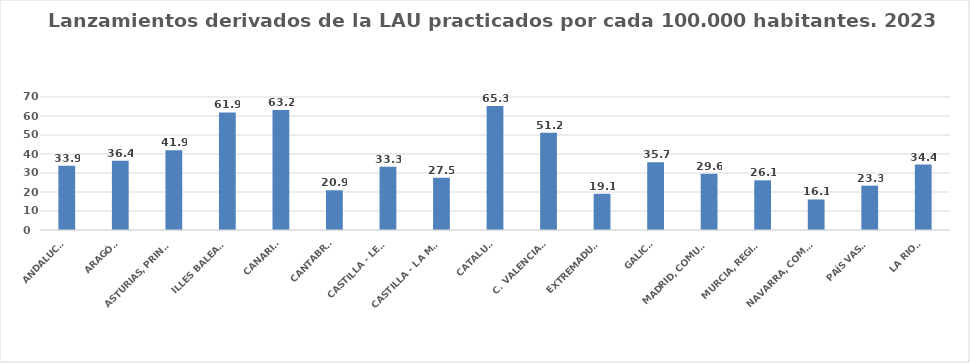
| Category | Series 0 |
|---|---|
| ANDALUCÍA | 33.859 |
| ARAGÓN | 36.388 |
| ASTURIAS, PRINCIPADO | 41.923 |
| ILLES BALEARS | 61.903 |
| CANARIAS | 63.175 |
| CANTABRIA | 20.9 |
| CASTILLA - LEÓN | 33.325 |
| CASTILLA - LA MANCHA | 27.54 |
| CATALUÑA | 65.299 |
| C. VALENCIANA | 51.224 |
| EXTREMADURA | 19.065 |
| GALICIA | 35.67 |
| MADRID, COMUNIDAD | 29.625 |
| MURCIA, REGIÓN | 26.148 |
| NAVARRA, COM. FORAL | 16.067 |
| PAÍS VASCO | 23.334 |
| LA RIOJA | 34.444 |